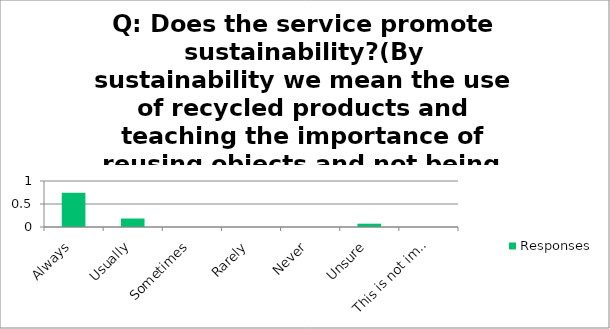
| Category | Responses |
|---|---|
| Always | 0.744 |
| Usually | 0.184 |
| Sometimes | 0 |
| Rarely | 0 |
| Never | 0 |
| Unsure | 0.072 |
| This is not important to me | 0 |